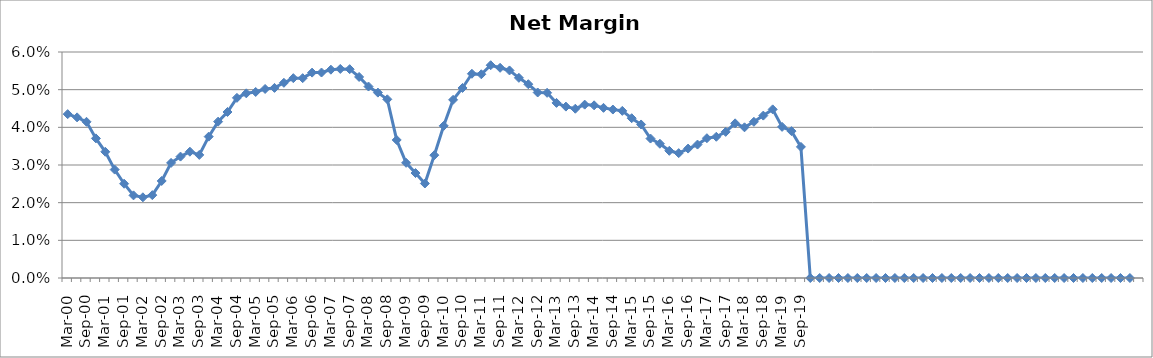
| Category | Series 0 |
|---|---|
| Mar-00 | 0.044 |
| Jun-00 | 0.043 |
| Sep-00 | 0.041 |
| Dec-00 | 0.037 |
| Mar-01 | 0.034 |
| Jun-01 | 0.029 |
| Sep-01 | 0.025 |
| Dec-01 | 0.022 |
| Mar-02 | 0.021 |
| Jun-02 | 0.022 |
| Sep-02 | 0.026 |
| Dec-02 | 0.031 |
| Mar-03 | 0.032 |
| Jun-03 | 0.034 |
| Sep-03 | 0.033 |
| Dec-03 | 0.038 |
| Mar-04 | 0.042 |
| Jun-04 | 0.044 |
| Sep-04 | 0.048 |
| Dec-04 | 0.049 |
| Mar-05 | 0.049 |
| Jun-05 | 0.05 |
| Sep-05 | 0.05 |
| Dec-05 | 0.052 |
| Mar-06 | 0.053 |
| Jun-06 | 0.053 |
| Sep-06 | 0.055 |
| Dec-06 | 0.055 |
| Mar-07 | 0.055 |
| Jun-07 | 0.056 |
| Sep-07 | 0.055 |
| Dec-07 | 0.053 |
| Mar-08 | 0.051 |
| Jun-08 | 0.049 |
| Sep-08 | 0.047 |
| Dec-08 | 0.037 |
| Mar-09 | 0.031 |
| Jun-09 | 0.028 |
| Sep-09 | 0.025 |
| Dec-09 | 0.033 |
| Mar-10 | 0.04 |
| Jun-10 | 0.047 |
| Sep-10 | 0.05 |
| Dec-10 | 0.054 |
| Mar-11 | 0.054 |
| Jun-11 | 0.056 |
| Sep-11 | 0.056 |
| Dec-11 | 0.055 |
| Mar-12 | 0.053 |
| Jun-12 | 0.051 |
| Sep-12 | 0.049 |
| Dec-12 | 0.049 |
| Mar-13 | 0.046 |
| Jun-13 | 0.046 |
| Sep-13 | 0.045 |
| Dec-13 | 0.046 |
| Mar-14 | 0.046 |
| Jun-14 | 0.045 |
| Sep-14 | 0.045 |
| Dec-14 | 0.044 |
| Mar-15 | 0.042 |
| Jun-15 | 0.041 |
| Sep-15 | 0.037 |
| Dec-15 | 0.036 |
| Mar-16 | 0.034 |
| Jun-16 | 0.033 |
| Sep-16 | 0.034 |
| Dec-16 | 0.035 |
| Mar-17 | 0.037 |
| Jun-17 | 0.037 |
| Sep-17 | 0.039 |
| Dec-17 | 0.041 |
| Mar-18 | 0.04 |
| Jun-18 | 0.041 |
| Sep-18 | 0.043 |
| Dec-18 | 0.045 |
| Mar-19 | 0.04 |
| Jun-19 | 0.039 |
| Sep-19 | 0.035 |